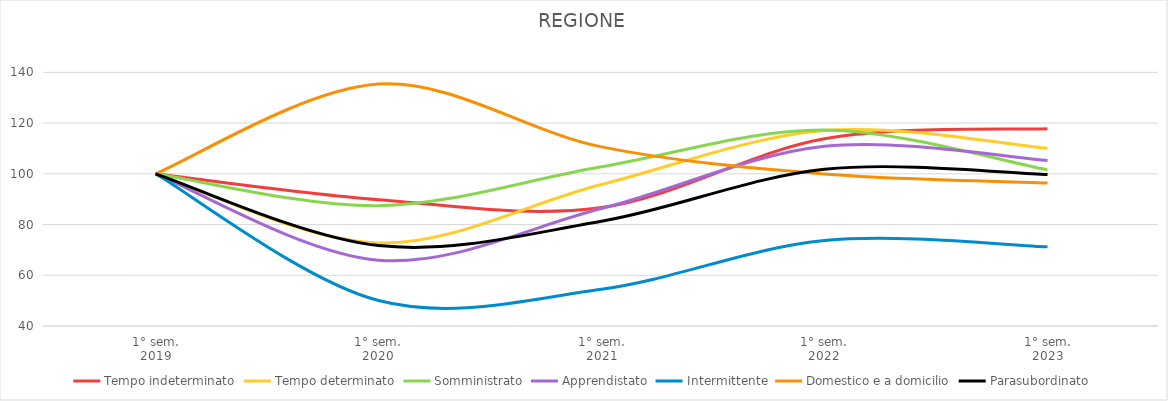
| Category | Tempo indeterminato | Tempo determinato | Somministrato | Apprendistato | Intermittente | Domestico e a domicilio | Parasubordinato |
|---|---|---|---|---|---|---|---|
| 1° sem.
2019 | 100 | 100 | 100 | 100 | 100 | 100 | 100 |
| 1° sem.
2020 | 89.795 | 72.714 | 87.441 | 65.943 | 50.039 | 135.376 | 71.694 |
| 1° sem.
2021 | 86.712 | 95.798 | 102.775 | 86.316 | 54.509 | 110.625 | 81.319 |
| 1° sem.
2022 | 113.81 | 117.065 | 117.28 | 110.838 | 73.718 | 99.953 | 101.819 |
| 1° sem.
2023 | 117.797 | 110.032 | 101.56 | 105.278 | 71.206 | 96.419 | 99.735 |